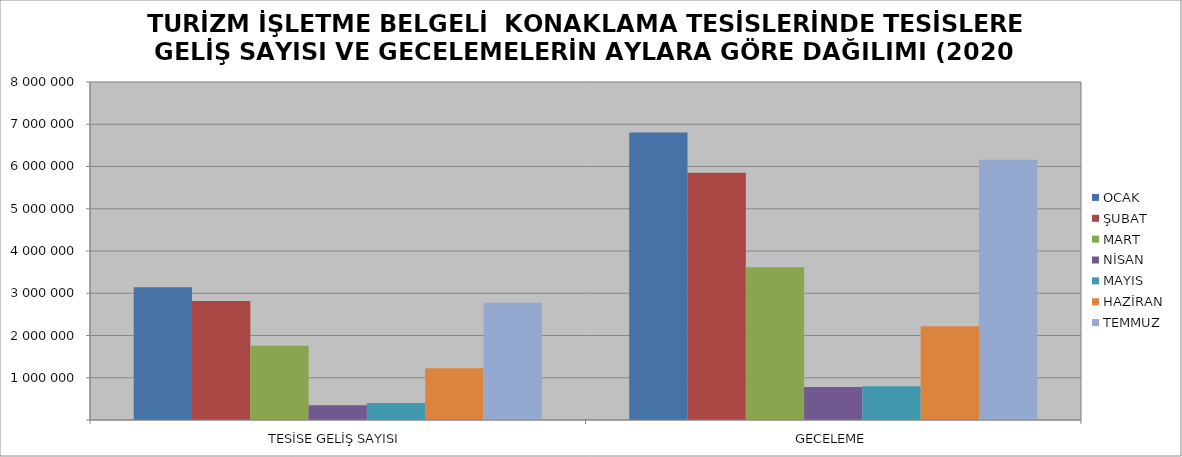
| Category | OCAK | ŞUBAT | MART | NİSAN | MAYIS | HAZİRAN | TEMMUZ |
|---|---|---|---|---|---|---|---|
| TESİSE GELİŞ SAYISI | 3140857 | 2816145 | 1756166 | 346964 | 400777 | 1222339 | 2777113 |
| GECELEME | 6806196 | 5853519 | 3616071 | 781724 | 800953 | 2221474 | 6159447 |